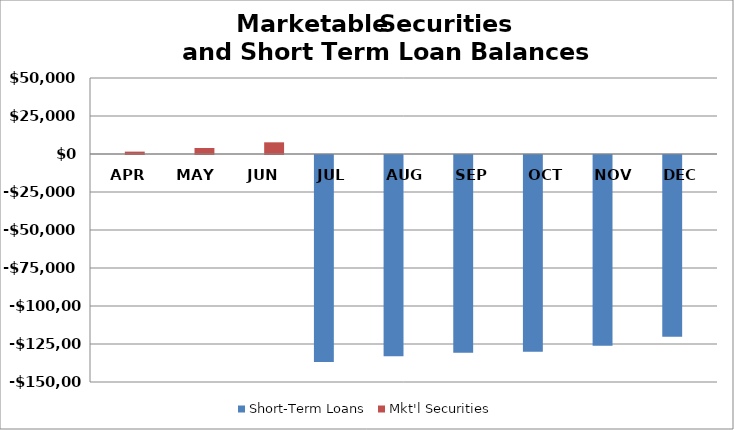
| Category | Short-Term Loans | Mkt'l Securities |
|---|---|---|
| APR | 0 | 1567 |
| MAY | 0 | 3931 |
| JUN | 0 | 7687 |
| JUL | -136162 | 0 |
| AUG | -132334 | 0 |
| SEP | -130056 | 0 |
| OCT | -129456 | 0 |
| NOV | -125496 | 0 |
| DEC | -119604 | 0 |